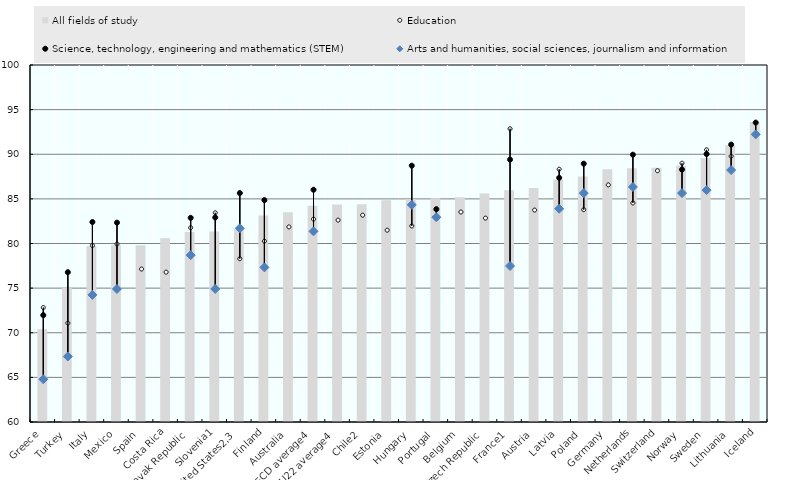
| Category | All fields of study |
|---|---|
| Greece | 70.4 |
| Turkey | 75.003 |
| Italy | 79.723 |
| Mexico | 79.806 |
| Spain | 79.811 |
| Costa Rica | 80.602 |
| Slovak Republic | 81.288 |
| Slovenia1 | 81.352 |
| United States2,3 | 81.608 |
| Finland | 83.128 |
| Australia | 83.515 |
| OECD average4 | 84.229 |
| EU22 average4 | 84.365 |
| Chile2 | 84.405 |
| Estonia | 84.852 |
| Hungary | 84.997 |
| Portugal | 85.075 |
| Belgium | 85.194 |
| Czech Republic | 85.599 |
| France1 | 85.974 |
| Austria | 86.212 |
| Latvia | 87.165 |
| Poland | 87.5 |
| Germany | 88.33 |
| Netherlands | 88.425 |
| Switzerland | 88.492 |
| Norway | 88.75 |
| Sweden | 89.556 |
| Lithuania | 91.006 |
| Iceland | 93.618 |